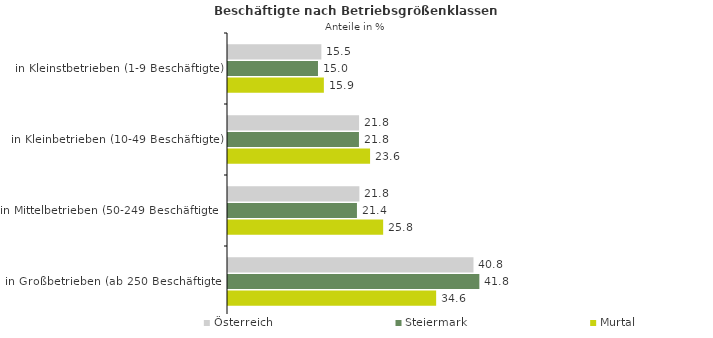
| Category | Österreich | Steiermark | Murtal |
|---|---|---|---|
| in Kleinstbetrieben (1-9 Beschäftigte) | 15.526 | 14.966 | 15.945 |
| in Kleinbetrieben (10-49 Beschäftigte) | 21.796 | 21.781 | 23.63 |
| in Mittelbetrieben (50-249 Beschäftigte) | 21.849 | 21.447 | 25.806 |
| in Großbetrieben (ab 250 Beschäftigte) | 40.829 | 41.806 | 34.619 |